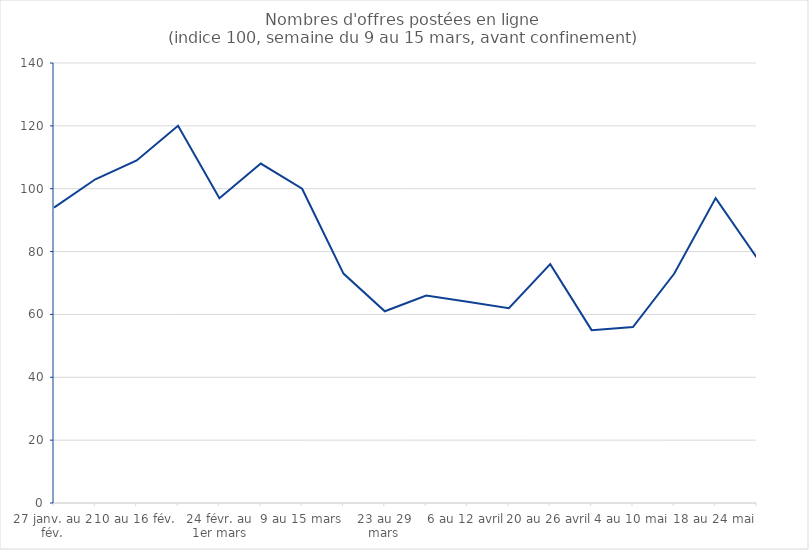
| Category | Series 0 |
|---|---|
| 27 janv. au 2 fév. | 94 |
| 3 au 9 fév. | 103 |
| 10 au 16 fév. | 109 |
| 17 au 23 fév. | 120 |
| 24 févr. au 1er mars | 97 |
| 2 au 8 mars | 108 |
| 9 au 15 mars | 100 |
| 16 au 22 mars | 73 |
| 23 au 29 mars | 61 |
| 30 mars au 5 avril | 66 |
| 6 au 12 avril | 64 |
| 13 au 19 avril | 62 |
| 20 au 26 avril | 76 |
| 27 avril au 3 mai | 55 |
| 4 au 10 mai | 56 |
| 11 au 17 mai | 73 |
| 18 au 24 mai | 97 |
| 25 au 31 mai | 78 |